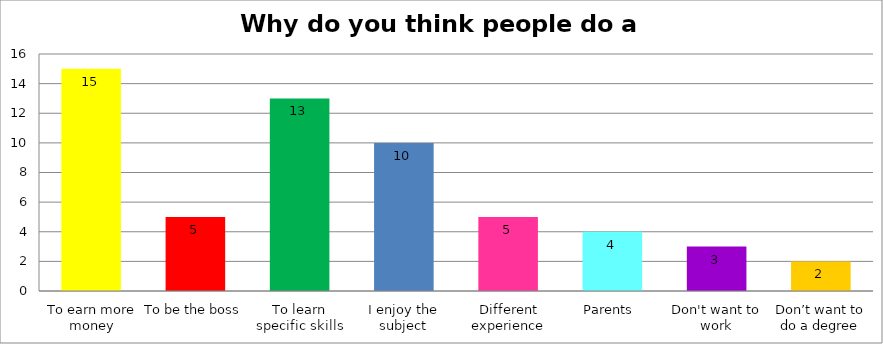
| Category | Series 0 |
|---|---|
| To earn more money | 15 |
| To be the boss | 5 |
| To learn specific skills | 13 |
| I enjoy the subject | 10 |
| Different experience | 5 |
| Parents  | 4 |
| Don't want to work | 3 |
| Don’t want to do a degree | 2 |